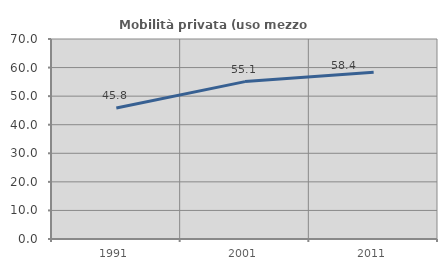
| Category | Mobilità privata (uso mezzo privato) |
|---|---|
| 1991.0 | 45.833 |
| 2001.0 | 55.085 |
| 2011.0 | 58.389 |